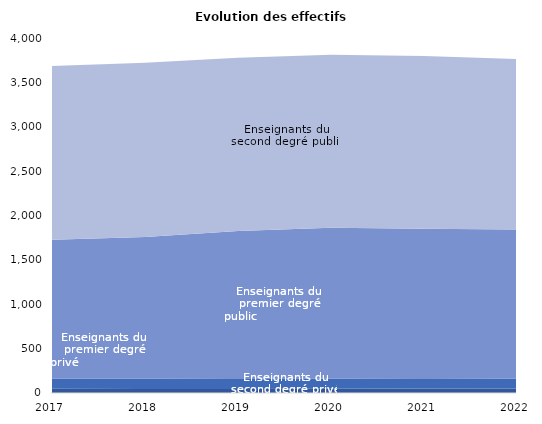
| Category | Enseignants du premier degré privé                                                                                               | Enseignants du second degré privé                                                                                                | Enseignants du premier degré public                                                                                              | Enseignants du second degré public                                                                                               |
|---|---|---|---|---|
| 2017 | 47 | 114 | 1566 | 1957 |
| 2018 | 45 | 115 | 1598 | 1964 |
| 2019 | 46 | 112 | 1666 | 1954 |
| 2020 | 49 | 111 | 1703 | 1949 |
| 2021 | 50 | 109 | 1691 | 1946 |
| 2022 | 50 | 110 | 1681 | 1922 |